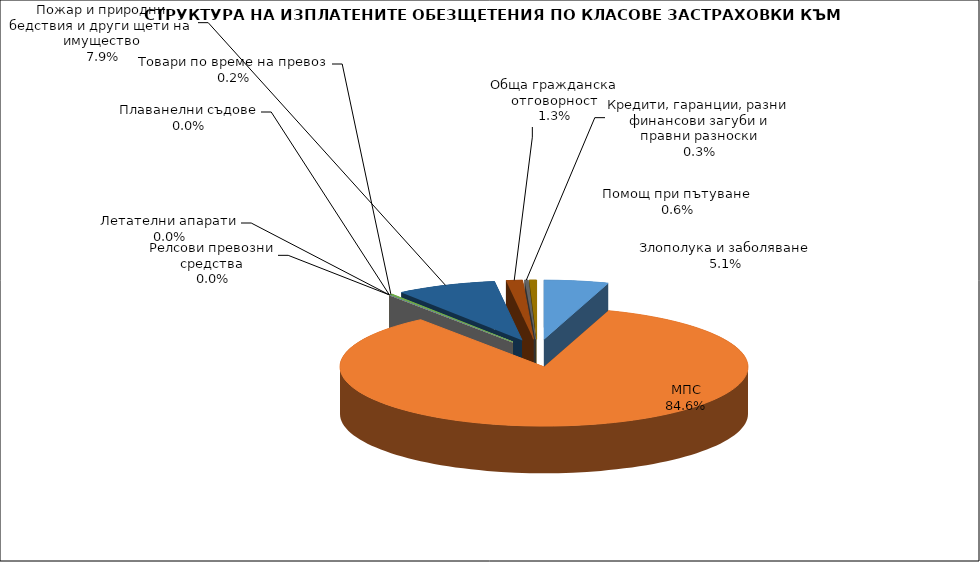
| Category | Series 0 |
|---|---|
| Злополука и заболяване | 0.051 |
| МПС | 0.846 |
| Релсови превозни средства | 0 |
| Летателни апарати | 0 |
| Плаванелни съдове | 0 |
| Товари по време на превоз | 0.002 |
| Пожар и природни бедствия и други щети на имущество | 0.079 |
| Обща гражданска отговорност | 0.013 |
| Кредити, гаранции, разни финансови загуби и правни разноски | 0.003 |
| Помощ при пътуване | 0.006 |